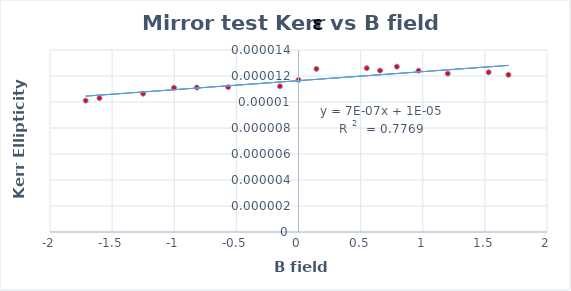
| Category | Kerr rotation vs B field |
|---|---|
| 0.14416841430664068 | 0 |
| 0.5493503663749237 | 0 |
| 0.6564987407407408 | 0 |
| 0.7914347519344563 | 0 |
| 0.9662760706235914 | 0 |
| 1.201008984910837 | 0 |
| 1.5303406705539362 | 0 |
| 1.6896887520000001 | 0 |
| 0.0 | 0 |
| -0.14953013516819977 | 0 |
| -0.5664749389204699 | 0 |
| -0.8187143805277631 | 0 |
| -1.002292599344737 | 0 |
| -1.2505017578500335 | 0 |
| -1.601748176259236 | 0 |
| -1.7128114221220538 | 0 |